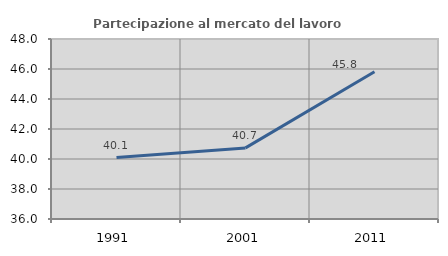
| Category | Partecipazione al mercato del lavoro  femminile |
|---|---|
| 1991.0 | 40.1 |
| 2001.0 | 40.741 |
| 2011.0 | 45.813 |